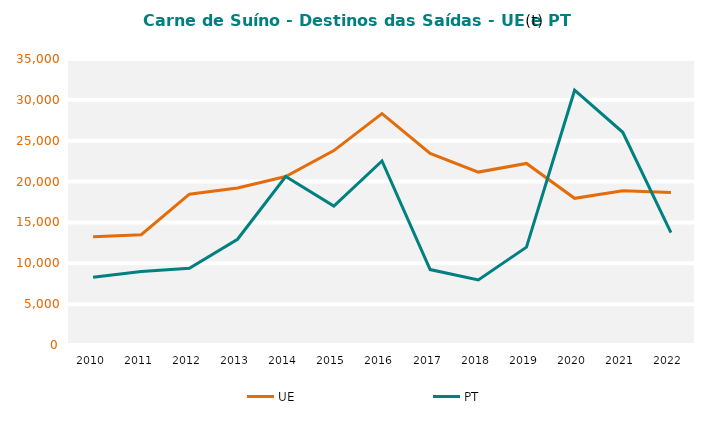
| Category | UE | PT |
|---|---|---|
| 2010.0 | 13254.608 | 8277.203 |
| 2011.0 | 13491.613 | 9005.855 |
| 2012.0 | 18459.16 | 9400.696 |
| 2013.0 | 19224.341 | 12938.735 |
| 2014.0 | 20612.87 | 20619.894 |
| 2015.0 | 23791.644 | 17001.419 |
| 2016.0 | 28322.268 | 22516.105 |
| 2017.0 | 23445.749 | 9229.644 |
| 2018.0 | 21161.538 | 7966.281 |
| 2019.0 | 22218.657 | 11974.853 |
| 2020.0 | 17948.541 | 31181.777 |
| 2021.0 | 18866.927 | 26030.343 |
| 2022.0 | 18667.694 | 13762.64 |